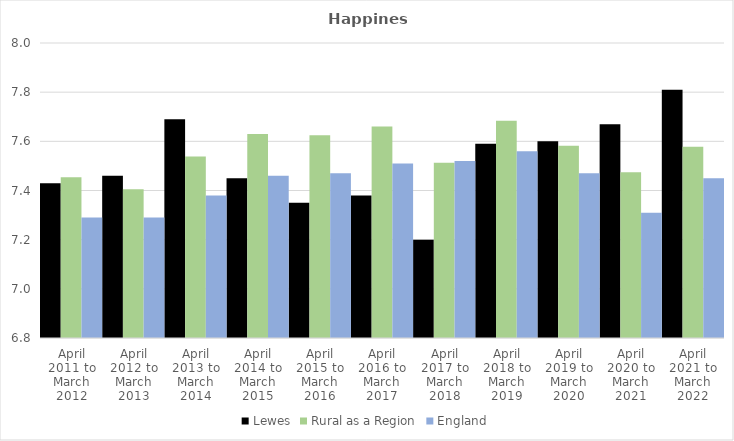
| Category | Lewes | Rural as a Region | England |
|---|---|---|---|
| April 2011 to March 2012 | 7.43 | 7.454 | 7.29 |
| April 2012 to March 2013 | 7.46 | 7.406 | 7.29 |
| April 2013 to March 2014 | 7.69 | 7.539 | 7.38 |
| April 2014 to March 2015 | 7.45 | 7.63 | 7.46 |
| April 2015 to March 2016 | 7.35 | 7.625 | 7.47 |
| April 2016 to March 2017 | 7.38 | 7.661 | 7.51 |
| April 2017 to March 2018 | 7.2 | 7.513 | 7.52 |
| April 2018 to March 2019 | 7.59 | 7.684 | 7.56 |
| April 2019 to March 2020 | 7.6 | 7.582 | 7.47 |
| April 2020 to March 2021 | 7.67 | 7.474 | 7.31 |
| April 2021 to March 2022 | 7.81 | 7.577 | 7.45 |